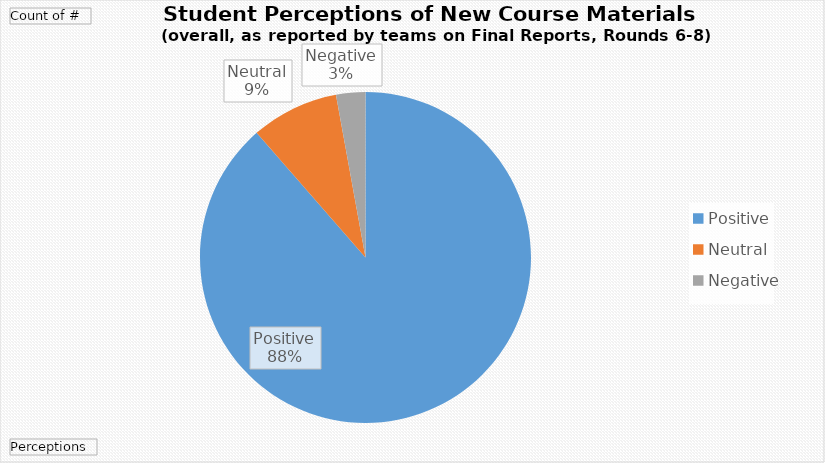
| Category | Total |
|---|---|
| Positive | 31 |
| Neutral | 3 |
| Negative | 1 |